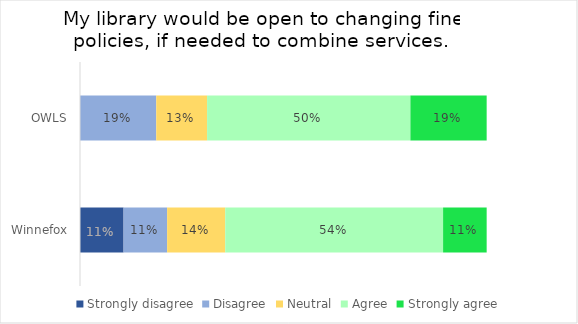
| Category | Strongly disagree | Disagree | Neutral | Agree | Strongly agree |
|---|---|---|---|---|---|
| OWLS | 0 | 0.188 | 0.125 | 0.5 | 0.188 |
| Winnefox | 0.107 | 0.107 | 0.143 | 0.536 | 0.107 |